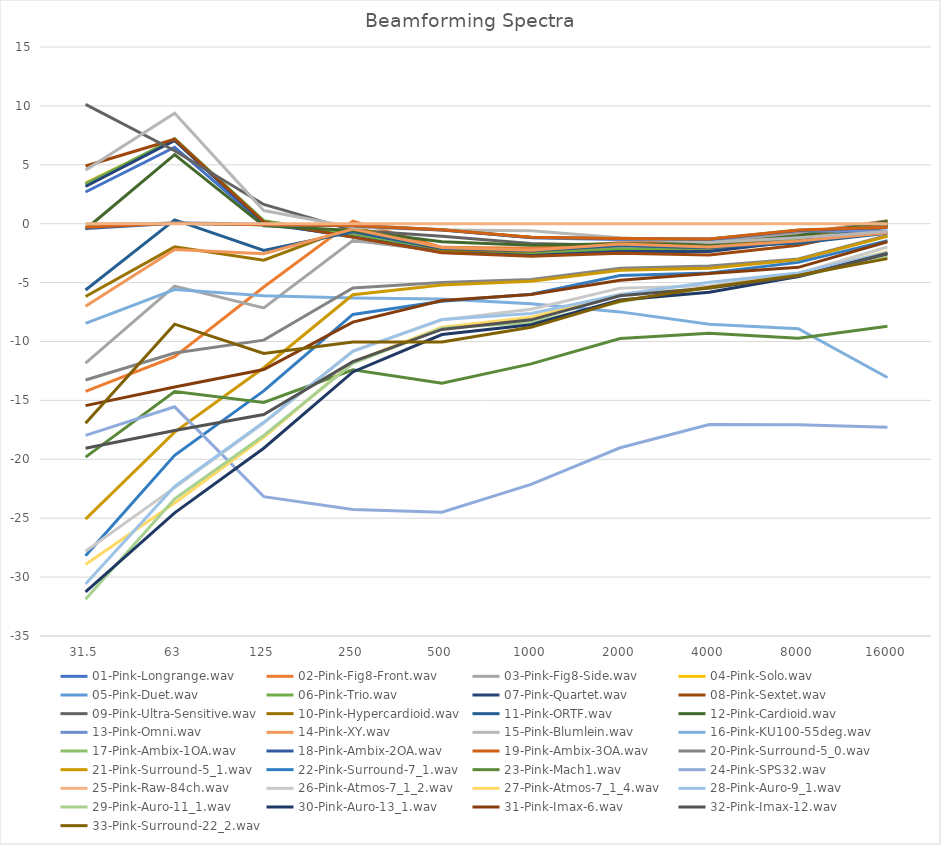
| Category | 01-Pink-Longrange.wav | 02-Pink-Fig8-Front.wav | 03-Pink-Fig8-Side.wav | 04-Pink-Solo.wav | 05-Pink-Duet.wav | 06-Pink-Trio.wav | 07-Pink-Quartet.wav | 08-Pink-Sextet.wav | 09-Pink-Ultra-Sensitive.wav | 10-Pink-Hypercardioid.wav | 11-Pink-ORTF.wav | 12-Pink-Cardioid.wav | 13-Pink-Omni.wav | 14-Pink-XY.wav | 15-Pink-Blumlein.wav | 16-Pink-KU100-55deg.wav | 17-Pink-Ambix-1OA.wav | 18-Pink-Ambix-2OA.wav | 19-Pink-Ambix-3OA.wav | 20-Pink-Surround-5_0.wav | 21-Pink-Surround-5_1.wav | 22-Pink-Surround-7_1.wav | 23-Pink-Mach1.wav | 24-Pink-SPS32.wav | 25-Pink-Raw-84ch.wav | 26-Pink-Atmos-7_1_2.wav | 27-Pink-Atmos-7_1_4.wav | 28-Pink-Auro-9_1.wav | 29-Pink-Auro-11_1.wav | 30-Pink-Auro-13_1.wav | 31-Pink-Imax-6.wav | 32-Pink-Imax-12.wav | 33-Pink-Surround-22_2.wav |
|---|---|---|---|---|---|---|---|---|---|---|---|---|---|---|---|---|---|---|---|---|---|---|---|---|---|---|---|---|---|---|---|---|---|
| 31.5 | 2.689 | -14.23 | -11.841 | 3.472 | 3.384 | 3.338 | 3.156 | 4.898 | 10.127 | -6.182 | -5.63 | -0.471 | -0.337 | -7.009 | 4.548 | -8.459 | -0.045 | -0.412 | -0.309 | -13.273 | -25.081 | -28.184 | -19.815 | -17.971 | 0 | -27.811 | -28.939 | -30.579 | -31.883 | -31.246 | -15.442 | -19.063 | -16.943 |
| 63.0 | 6.493 | -11.294 | -5.297 | 7.079 | 7.07 | 7.236 | 7.08 | 7.172 | 6.195 | -1.965 | 0.33 | 5.862 | 0.078 | -2.192 | 9.379 | -5.595 | 0.036 | 0.039 | 0.046 | -10.982 | -17.695 | -19.665 | -14.245 | -15.546 | 0 | -22.407 | -23.713 | -22.308 | -23.355 | -24.544 | -13.86 | -17.554 | -8.525 |
| 125.0 | -0.047 | -5.373 | -7.149 | 0.202 | 0.182 | 0.257 | 0.081 | 0.153 | 1.632 | -3.094 | -2.269 | -0.181 | -0.043 | -2.555 | 1.113 | -6.12 | -0.08 | -0.093 | -0.079 | -9.884 | -12.231 | -14.197 | -15.181 | -23.171 | 0 | -16.918 | -18.134 | -16.859 | -17.978 | -19.062 | -12.383 | -16.204 | -11.008 |
| 250.0 | -0.993 | 0.226 | -1.429 | -0.939 | -0.98 | -0.948 | -1.123 | -1.141 | -0.552 | -0.265 | -0.692 | -0.586 | -0.13 | -0.445 | -0.294 | -6.299 | -0.155 | -0.184 | -0.153 | -5.459 | -6.03 | -7.704 | -12.403 | -24.263 | 0 | -10.822 | -11.755 | -10.831 | -11.862 | -12.584 | -8.358 | -11.714 | -10.035 |
| 500.0 | -2.403 | -2.005 | -2.316 | -2.266 | -2.275 | -2.23 | -2.431 | -2.459 | -1.068 | -2.254 | -2.114 | -1.528 | -0.512 | -2.021 | -0.528 | -6.383 | -0.518 | -0.53 | -0.508 | -4.993 | -5.207 | -6.582 | -13.533 | -24.494 | 0 | -8.165 | -8.786 | -8.126 | -8.882 | -9.407 | -6.526 | -8.978 | -10.032 |
| 1000.0 | -2.68 | -2.084 | -2.556 | -2.532 | -2.543 | -2.495 | -2.703 | -2.754 | -1.69 | -2.331 | -2.304 | -1.839 | -1.197 | -2.258 | -0.607 | -6.803 | -1.16 | -1.179 | -1.153 | -4.731 | -4.881 | -5.985 | -11.898 | -22.128 | 0 | -7.258 | -7.942 | -7.624 | -8.388 | -8.571 | -6.006 | -8.161 | -8.797 |
| 2000.0 | -2.356 | -1.622 | -1.918 | -2.194 | -2.208 | -2.158 | -2.361 | -2.507 | -1.85 | -1.826 | -1.841 | -1.698 | -1.36 | -1.727 | -1.189 | -7.486 | -1.263 | -1.279 | -1.257 | -3.778 | -3.943 | -4.395 | -9.75 | -19.02 | 0 | -5.469 | -5.988 | -6.005 | -6.637 | -6.481 | -4.793 | -6.114 | -6.562 |
| 4000.0 | -2.319 | -1.584 | -1.531 | -2.169 | -2.185 | -2.144 | -2.35 | -2.652 | -2.054 | -1.875 | -2.019 | -1.752 | -1.391 | -1.974 | -1.599 | -8.537 | -1.296 | -1.313 | -1.289 | -3.587 | -3.772 | -4.184 | -9.294 | -17.052 | 0 | -5.278 | -5.508 | -4.966 | -5.425 | -5.824 | -4.229 | -5.449 | -5.402 |
| 8000.0 | -1.384 | -0.829 | -0.908 | -1.27 | -1.297 | -1.276 | -1.466 | -1.826 | -1.11 | -1.073 | -1.638 | -1.017 | -0.597 | -1.478 | -1.186 | -8.914 | -0.55 | -0.568 | -0.544 | -2.999 | -3.061 | -3.284 | -9.716 | -17.071 | 0 | -4.224 | -4.285 | -4.181 | -4.5 | -4.486 | -3.705 | -4.47 | -4.373 |
| 16000.0 | -0.117 | 0.252 | 0.224 | -0.02 | -0.112 | -0.087 | -0.228 | -0.238 | 0.053 | 0.17 | -0.82 | 0.213 | -0.627 | -0.776 | -0.667 | -13.055 | -0.298 | -0.315 | -0.292 | -0.998 | -1.067 | -1.434 | -8.713 | -17.276 | 0 | -1.977 | -2.366 | -2.448 | -2.761 | -2.524 | -1.527 | -2.55 | -2.966 |